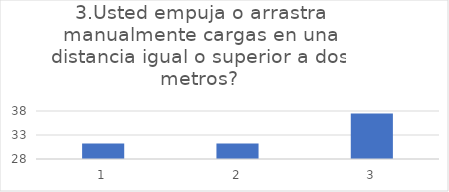
| Category | Usted empuja o arrastra manualmente cargas en una distancia igual o superior a dos metros? |
|---|---|
| 0 | 31.25 |
| 1 | 31.25 |
| 2 | 37.5 |